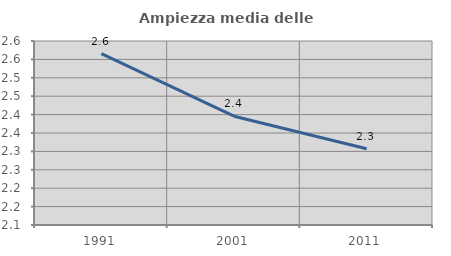
| Category | Ampiezza media delle famiglie |
|---|---|
| 1991.0 | 2.566 |
| 2001.0 | 2.396 |
| 2011.0 | 2.307 |